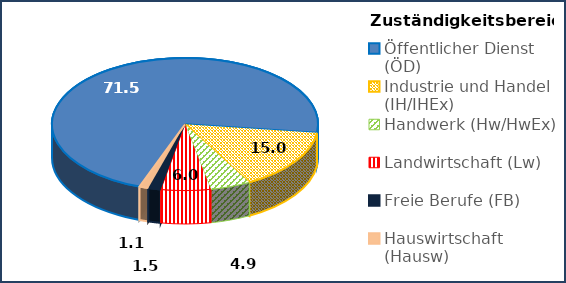
| Category | Series 0 |
|---|---|
| Öffentlicher Dienst (ÖD) | 71.471 |
| Industrie und Handel (IH/IHEx) | 14.952 |
| Handwerk (Hw/HwEx) | 4.919 |
| Landwirtschaft (Lw) | 6.029 |
| Freie Berufe (FB) | 1.53 |
| Hauswirtschaft (Hausw) | 1.11 |